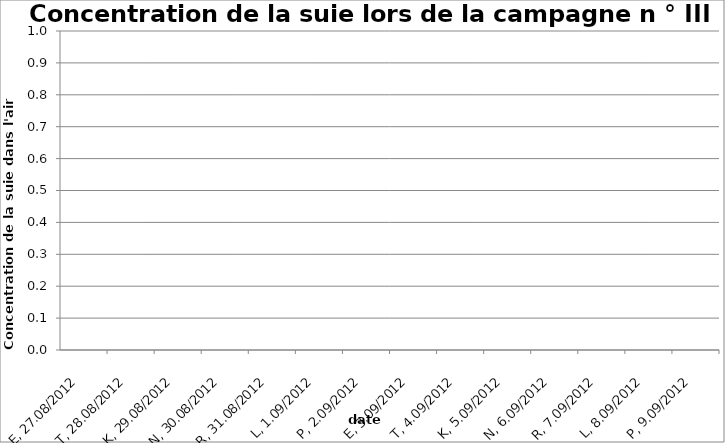
| Category | Series 0 |
|---|---|
| 2012-08-27 | 0 |
| 2012-08-28 | 0 |
| 2012-08-29 | 0 |
| 2012-08-30 | 0 |
| 2012-08-31 | 0 |
| 2012-09-01 | 0 |
| 2012-09-02 | 0 |
| 2012-09-03 | 0 |
| 2012-09-04 | 0 |
| 2012-09-05 | 0 |
| 2012-09-06 | 0 |
| 2012-09-07 | 0 |
| 2012-09-08 | 0 |
| 2012-09-09 | 0 |